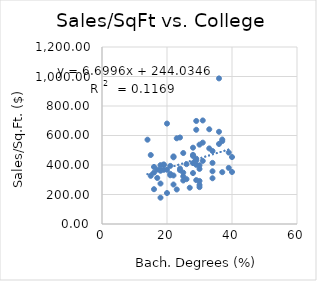
| Category | MedIncome |
|---|---|
| 45177.0 | 701.97 |
| 51888.0 | 209.93 |
| 51379.0 | 364.92 |
| 66081.0 | 443.04 |
| 50999.0 | 399.2 |
| 41562.0 | 264.64 |
| 44196.0 | 571.59 |
| 50975.0 | 642.25 |
| 72808.0 | 461.45 |
| 79070.0 | 638.82 |
| 78497.0 | 484.38 |
| 41245.0 | 581.09 |
| 33003.0 | 267.71 |
| 90988.0 | 572.84 |
| 37950.0 | 586.48 |
| 45206.0 | 368.73 |
| 79312.0 | 351.47 |
| 37345.0 | 458.24 |
| 46226.0 | 987.12 |
| 70024.0 | 357.45 |
| 54982.0 | 405.77 |
| 54932.0 | 680.8 |
| 34097.0 | 368.02 |
| 46593.0 | 303.95 |
| 51893.0 | 393.9 |
| 88162.0 | 562.12 |
| 89016.0 | 494.88 |
| 114353.0 | 310.07 |
| 75366.0 | 373.46 |
| 48163.0 | 235.81 |
| 49956.0 | 413.08 |
| 45990.0 | 625.22 |
| 45723.0 | 274.3 |
| 43800.0 | 542.62 |
| 68711.0 | 178.56 |
| 65150.0 | 375.33 |
| 39329.0 | 329.09 |
| 63657.0 | 297.37 |
| 67099.0 | 323.17 |
| 75151.0 | 468.84 |
| 93876.0 | 352.57 |
| 79701.0 | 380.34 |
| 77115.0 | 398.12 |
| 52766.0 | 312.15 |
| 32929.0 | 452.16 |
| 87863.0 | 698.64 |
| 73752.0 | 367.19 |
| 85366.0 | 431.93 |
| 39180.0 | 367.06 |
| 56077.0 | 400.53 |
| 77449.0 | 414.36 |
| 56822.0 | 481.11 |
| 80470.0 | 538.06 |
| 55584.0 | 330.48 |
| 78001.0 | 249.93 |
| 75307.0 | 291.87 |
| 76375.0 | 517.4 |
| 61857.0 | 551.58 |
| 61312.0 | 386.81 |
| 72040.0 | 427.5 |
| 92414.0 | 453.94 |
| 92602.0 | 512.46 |
| 59599.0 | 345.27 |
| 72453.0 | 234.04 |
| 67925.0 | 348.33 |
| 42631.0 | 348.47 |
| 75652.0 | 294.95 |
| 39650.0 | 361.14 |
| 48033.0 | 467.71 |
| 67403.0 | 403.78 |
| 80597.0 | 245.74 |
| 60928.0 | 339.94 |
| 73762.0 | 400.82 |
| 64225.0 | 326.54 |